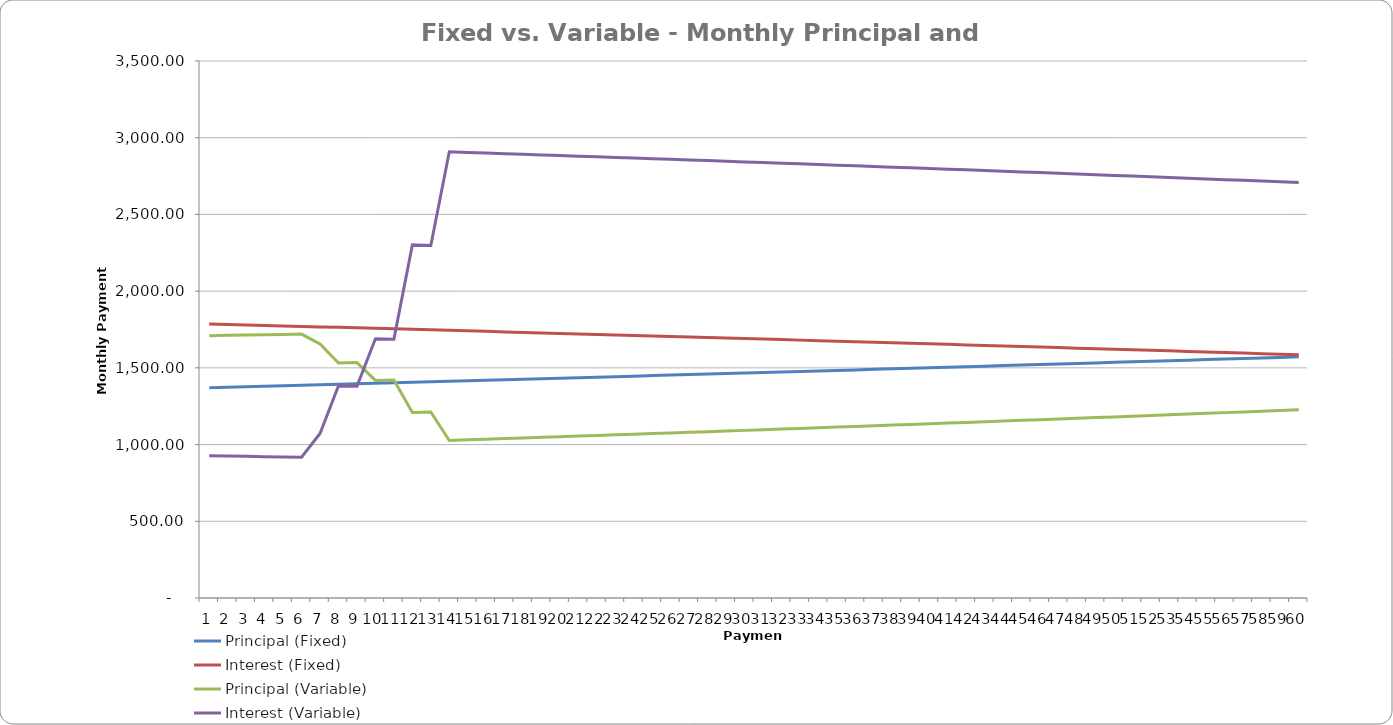
| Category | Principal (Fixed) | Interest (Fixed) | Principal (Variable) | Interest (Variable) |
|---|---|---|---|---|
| 0 | 1370.99 | 1786.27 | 1709.77 | 927.62 |
| 1 | 1374.17 | 1783.09 | 1711.83 | 925.56 |
| 2 | 1377.35 | 1779.91 | 1713.89 | 923.5 |
| 3 | 1380.55 | 1776.71 | 1715.96 | 921.43 |
| 4 | 1383.75 | 1773.51 | 1718.03 | 919.36 |
| 5 | 1386.96 | 1770.3 | 1720.1 | 917.29 |
| 6 | 1390.18 | 1767.08 | 1655.81 | 1072.46 |
| 7 | 1393.4 | 1763.86 | 1531.4 | 1383.44 |
| 8 | 1396.64 | 1760.62 | 1534.2 | 1380.64 |
| 9 | 1399.88 | 1757.38 | 1418.06 | 1689.25 |
| 10 | 1403.12 | 1754.14 | 1421.23 | 1686.08 |
| 11 | 1406.38 | 1750.88 | 1208.45 | 2301.45 |
| 12 | 1409.64 | 1747.62 | 1212.15 | 2297.75 |
| 13 | 1412.91 | 1744.35 | 1026.91 | 2908.09 |
| 14 | 1416.19 | 1741.07 | 1030.89 | 2904.11 |
| 15 | 1419.47 | 1737.79 | 1034.89 | 2900.11 |
| 16 | 1422.77 | 1734.49 | 1038.9 | 2896.1 |
| 17 | 1426.07 | 1731.19 | 1042.93 | 2892.07 |
| 18 | 1429.38 | 1727.88 | 1046.98 | 2888.02 |
| 19 | 1432.69 | 1724.57 | 1051.04 | 2883.96 |
| 20 | 1436.02 | 1721.24 | 1055.12 | 2879.88 |
| 21 | 1439.35 | 1717.91 | 1059.21 | 2875.79 |
| 22 | 1442.69 | 1714.57 | 1063.32 | 2871.68 |
| 23 | 1446.03 | 1711.23 | 1067.44 | 2867.56 |
| 24 | 1449.39 | 1707.87 | 1071.58 | 2863.42 |
| 25 | 1452.75 | 1704.51 | 1075.74 | 2859.26 |
| 26 | 1456.12 | 1701.14 | 1079.91 | 2855.09 |
| 27 | 1459.5 | 1697.76 | 1084.1 | 2850.9 |
| 28 | 1462.88 | 1694.38 | 1088.31 | 2846.69 |
| 29 | 1466.28 | 1690.98 | 1092.53 | 2842.47 |
| 30 | 1469.68 | 1687.58 | 1096.76 | 2838.24 |
| 31 | 1473.09 | 1684.17 | 1101.02 | 2833.98 |
| 32 | 1476.51 | 1680.75 | 1105.29 | 2829.71 |
| 33 | 1479.93 | 1677.33 | 1109.58 | 2825.42 |
| 34 | 1483.36 | 1673.9 | 1113.88 | 2821.12 |
| 35 | 1486.81 | 1670.45 | 1118.2 | 2816.8 |
| 36 | 1490.25 | 1667.01 | 1122.54 | 2812.46 |
| 37 | 1493.71 | 1663.55 | 1126.89 | 2808.11 |
| 38 | 1497.18 | 1660.08 | 1131.26 | 2803.74 |
| 39 | 1500.65 | 1656.61 | 1135.65 | 2799.35 |
| 40 | 1504.13 | 1653.13 | 1140.06 | 2794.94 |
| 41 | 1507.62 | 1649.64 | 1144.48 | 2790.52 |
| 42 | 1511.12 | 1646.14 | 1148.92 | 2786.08 |
| 43 | 1514.62 | 1642.64 | 1153.37 | 2781.63 |
| 44 | 1518.14 | 1639.12 | 1157.85 | 2777.15 |
| 45 | 1521.66 | 1635.6 | 1162.34 | 2772.66 |
| 46 | 1525.19 | 1632.07 | 1166.85 | 2768.15 |
| 47 | 1528.73 | 1628.53 | 1171.37 | 2763.63 |
| 48 | 1532.27 | 1624.99 | 1175.92 | 2759.08 |
| 49 | 1535.83 | 1621.43 | 1180.48 | 2754.52 |
| 50 | 1539.39 | 1617.87 | 1185.06 | 2749.94 |
| 51 | 1542.96 | 1614.3 | 1189.65 | 2745.35 |
| 52 | 1546.54 | 1610.72 | 1194.27 | 2740.73 |
| 53 | 1550.13 | 1607.13 | 1198.9 | 2736.1 |
| 54 | 1553.73 | 1603.53 | 1203.55 | 2731.45 |
| 55 | 1557.33 | 1599.93 | 1208.22 | 2726.78 |
| 56 | 1560.94 | 1596.32 | 1212.91 | 2722.09 |
| 57 | 1564.56 | 1592.7 | 1217.61 | 2717.39 |
| 58 | 1568.19 | 1589.07 | 1222.33 | 2712.67 |
| 59 | 1571.83 | 1585.43 | 1227.08 | 2707.92 |